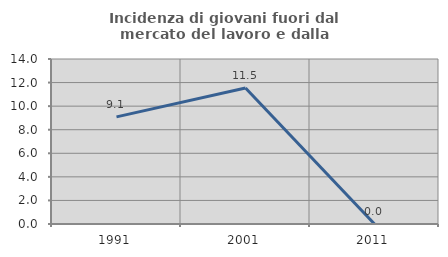
| Category | Incidenza di giovani fuori dal mercato del lavoro e dalla formazione  |
|---|---|
| 1991.0 | 9.091 |
| 2001.0 | 11.538 |
| 2011.0 | 0 |